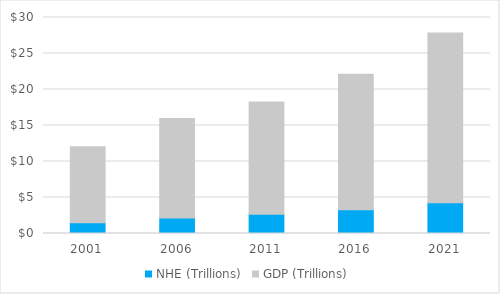
| Category | NHE (Trillions) | GDP (Trillions) |
|---|---|---|
| 2001.0 | 1.483 | 10.582 |
| 2006.0 | 2.165 | 13.816 |
| 2011.0 | 2.677 | 15.6 |
| 2016.0 | 3.307 | 18.805 |
| 2021.0 | 4.255 | 23.594 |